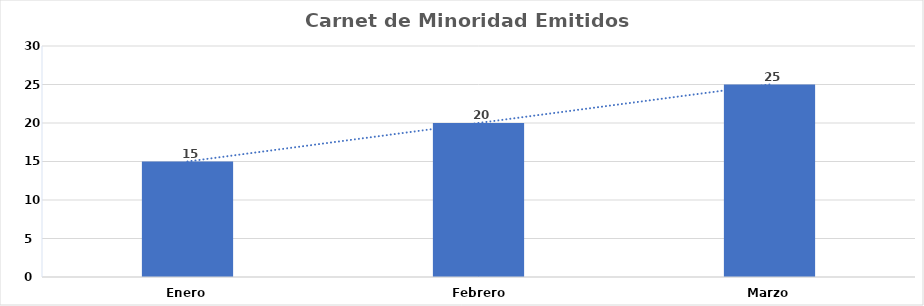
| Category | Series 0 |
|---|---|
| Enero | 15 |
| Febrero  | 20 |
| Marzo | 25 |